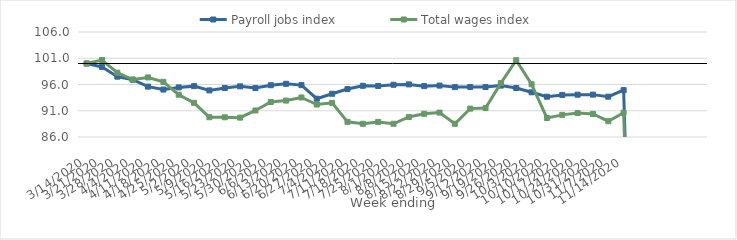
| Category | Payroll jobs index | Total wages index |
|---|---|---|
| 14/03/2020 | 100 | 100 |
| 21/03/2020 | 99.348 | 100.66 |
| 28/03/2020 | 97.492 | 98.248 |
| 04/04/2020 | 96.916 | 96.946 |
| 11/04/2020 | 95.596 | 97.346 |
| 18/04/2020 | 95.036 | 96.511 |
| 25/04/2020 | 95.448 | 94.049 |
| 02/05/2020 | 95.689 | 92.505 |
| 09/05/2020 | 94.88 | 89.765 |
| 16/05/2020 | 95.336 | 89.755 |
| 23/05/2020 | 95.648 | 89.689 |
| 30/05/2020 | 95.32 | 91.053 |
| 06/06/2020 | 95.858 | 92.664 |
| 13/06/2020 | 96.132 | 92.936 |
| 20/06/2020 | 95.885 | 93.532 |
| 27/06/2020 | 93.289 | 92.184 |
| 04/07/2020 | 94.236 | 92.5 |
| 11/07/2020 | 95.133 | 88.888 |
| 18/07/2020 | 95.753 | 88.516 |
| 25/07/2020 | 95.718 | 88.874 |
| 01/08/2020 | 95.946 | 88.521 |
| 08/08/2020 | 96.02 | 89.819 |
| 15/08/2020 | 95.69 | 90.42 |
| 22/08/2020 | 95.791 | 90.651 |
| 29/08/2020 | 95.501 | 88.523 |
| 05/09/2020 | 95.53 | 91.405 |
| 12/09/2020 | 95.513 | 91.511 |
| 19/09/2020 | 95.789 | 96.265 |
| 26/09/2020 | 95.332 | 100.638 |
| 03/10/2020 | 94.515 | 96.045 |
| 10/10/2020 | 93.673 | 89.62 |
| 17/10/2020 | 94.01 | 90.215 |
| 24/10/2020 | 94.058 | 90.567 |
| 31/10/2020 | 94.071 | 90.389 |
| 07/11/2020 | 93.68 | 89.008 |
| 14/11/2020 | 94.932 | 90.634 |